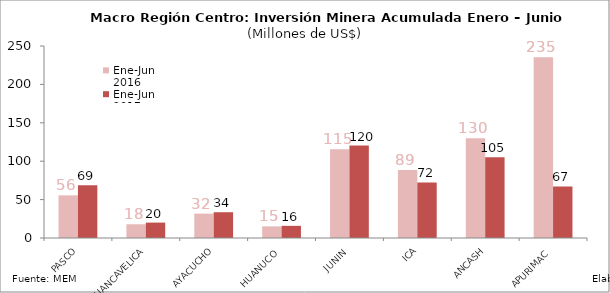
| Category | Ene-Jun 2016 | Ene-Jun 2017 |
|---|---|---|
| PASCO | 55.512 | 68.651 |
| HUANCAVELICA | 17.911 | 20.074 |
| AYACUCHO | 31.775 | 33.577 |
| HUANUCO | 15.128 | 15.822 |
| JUNIN | 115.472 | 120.386 |
| ICA | 88.69 | 72.426 |
| ANCASH | 129.941 | 105.265 |
| APURIMAC | 235.207 | 67.097 |